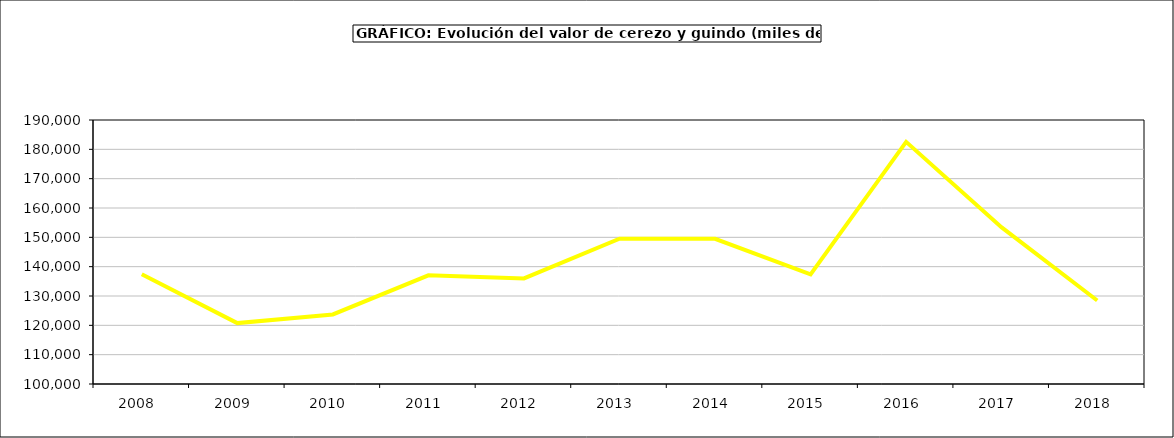
| Category | valor cerezo y guindo |
|---|---|
| 2008.0 | 137384.834 |
| 2009.0 | 120767.336 |
| 2010.0 | 123711.92 |
| 2011.0 | 137034.469 |
| 2012.0 | 136005.543 |
| 2013.0 | 149538.377 |
| 2014.0 | 149493.495 |
| 2015.0 | 137364 |
| 2016.0 | 182544 |
| 2017.0 | 153374.55 |
| 2018.0 | 128453.5 |